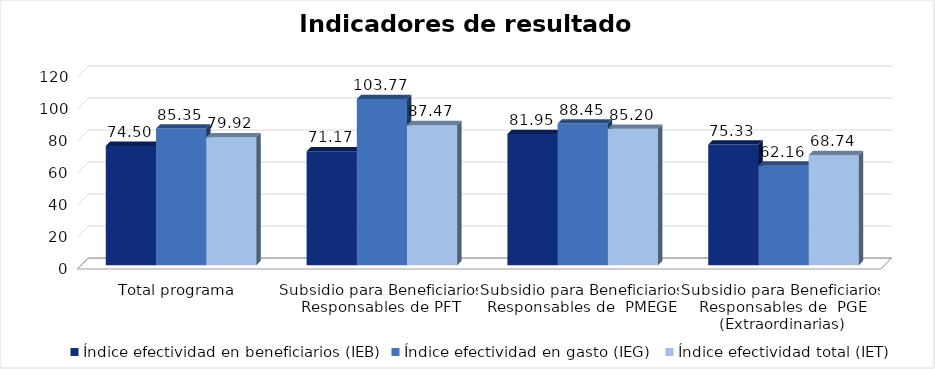
| Category | Índice efectividad en beneficiarios (IEB) | Índice efectividad en gasto (IEG)  | Índice efectividad total (IET) |
|---|---|---|---|
| Total programa | 74.503 | 85.346 | 79.924 |
| Subsidio para Beneficiarios Responsables de PFT | 71.172 | 103.769 | 87.471 |
| Subsidio para Beneficiarios Responsables de  PMEGE | 81.953 | 88.452 | 85.202 |
| Subsidio para Beneficiarios Responsables de  PGE (Extraordinarias) | 75.332 | 62.157 | 68.744 |